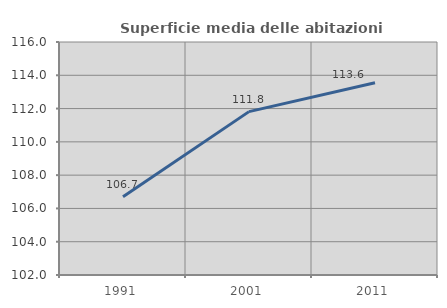
| Category | Superficie media delle abitazioni occupate |
|---|---|
| 1991.0 | 106.695 |
| 2001.0 | 111.816 |
| 2011.0 | 113.553 |